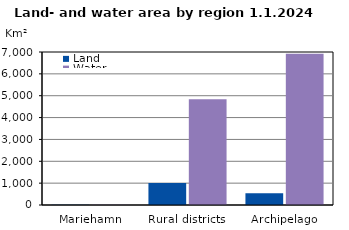
| Category | Land | Water |
|---|---|---|
| Mariehamn | 11.83 | 8.93 |
| Rural districts | 1007.51 | 4838.1 |
| Archipelago | 536.25 | 6921.89 |